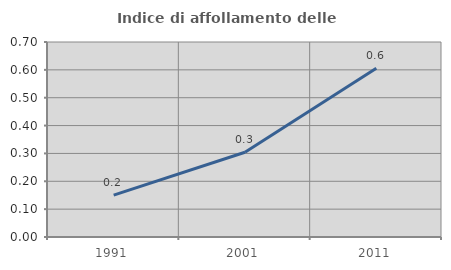
| Category | Indice di affollamento delle abitazioni  |
|---|---|
| 1991.0 | 0.15 |
| 2001.0 | 0.304 |
| 2011.0 | 0.606 |